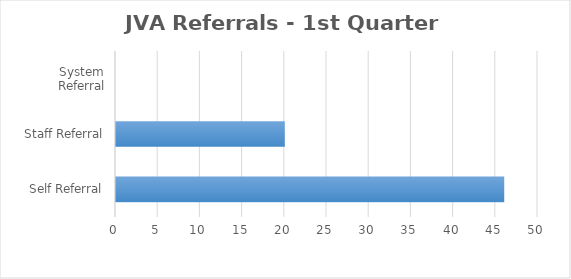
| Category | Series 0 |
|---|---|
| Self Referral | 46 |
| Staff Referral | 20 |
| System Referral | 0 |